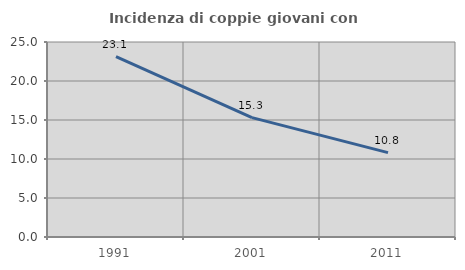
| Category | Incidenza di coppie giovani con figli |
|---|---|
| 1991.0 | 23.126 |
| 2001.0 | 15.304 |
| 2011.0 | 10.817 |